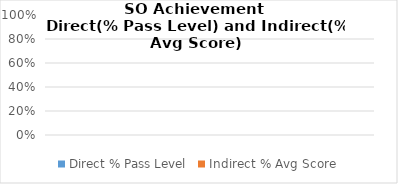
| Category | Direct % Pass Level | Indirect % Avg Score |
|---|---|---|
|  | 0 | 0 |
|  | 0 | 0 |
|  | 0 | 0 |
|  | 0 | 0 |
|  | 0 | 0 |
|  | 0 | 0 |